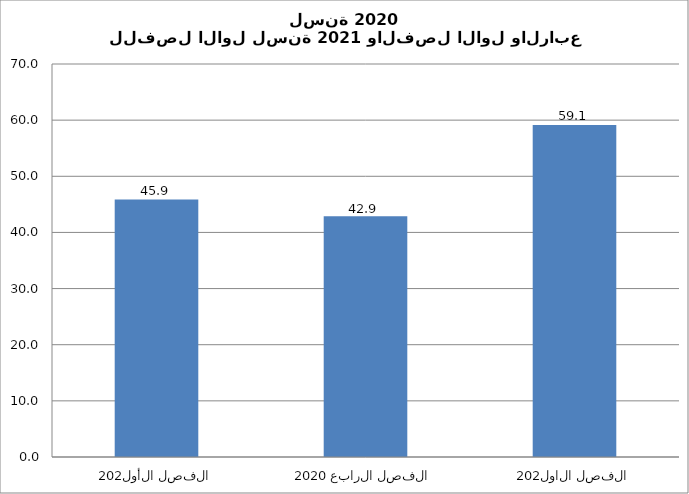
| Category | Series 0 |
|---|---|
| الفصل الأول 2020 | 45.851 |
| الفصل الرابع 2020 | 42.9 |
| الفصل الاول 2021 | 59.148 |